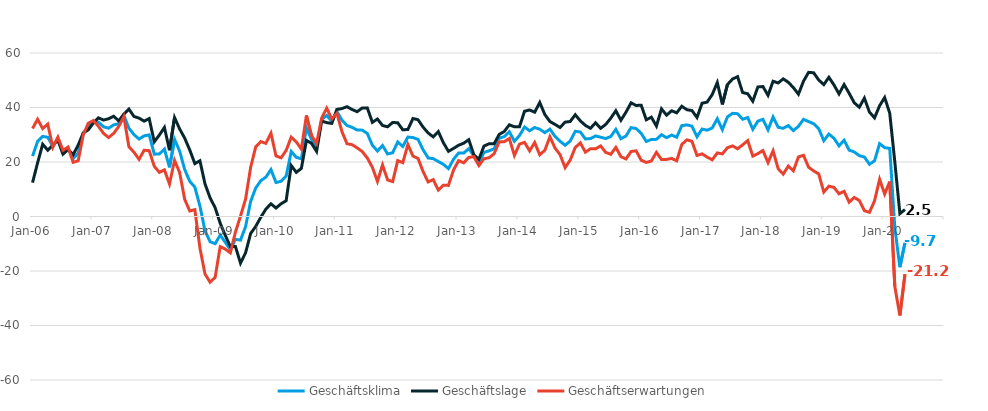
| Category | Geschäftsklima | Geschäftslage | Geschäftserwartungen |
|---|---|---|---|
| 2006-01-01 | 22.149 | 12.438 | 32.303 |
| 2006-02-01 | 27.555 | 19.705 | 35.685 |
| 2006-03-01 | 29.38 | 26.528 | 32.269 |
| 2006-04-01 | 29.074 | 24.346 | 33.901 |
| 2006-05-01 | 25.806 | 26.176 | 25.436 |
| 2006-06-01 | 28.536 | 27.957 | 29.115 |
| 2006-07-01 | 23.572 | 22.875 | 24.271 |
| 2006-08-01 | 25.039 | 24.574 | 25.504 |
| 2006-09-01 | 21.261 | 22.648 | 19.883 |
| 2006-10-01 | 23.302 | 26.195 | 20.447 |
| 2006-11-01 | 30.369 | 30.698 | 30.04 |
| 2006-12-01 | 33.025 | 31.805 | 34.252 |
| 2007-01-01 | 34.776 | 34.334 | 35.219 |
| 2007-02-01 | 34.623 | 36.186 | 33.07 |
| 2007-03-01 | 32.941 | 35.406 | 30.502 |
| 2007-04-01 | 32.398 | 35.869 | 28.977 |
| 2007-05-01 | 33.632 | 36.783 | 30.522 |
| 2007-06-01 | 34.063 | 35.077 | 33.054 |
| 2007-07-01 | 37.112 | 37.583 | 36.642 |
| 2007-08-01 | 32.407 | 39.418 | 25.601 |
| 2007-09-01 | 30.047 | 36.706 | 23.574 |
| 2007-10-01 | 28.417 | 36.106 | 20.979 |
| 2007-11-01 | 29.592 | 34.991 | 24.318 |
| 2007-12-01 | 29.961 | 35.919 | 24.153 |
| 2008-01-01 | 22.877 | 27.411 | 18.434 |
| 2008-02-01 | 22.932 | 29.884 | 16.191 |
| 2008-03-01 | 24.763 | 32.689 | 17.106 |
| 2008-04-01 | 18.039 | 24.317 | 11.937 |
| 2008-05-01 | 28.304 | 36.294 | 20.584 |
| 2008-06-01 | 23.998 | 32.137 | 16.145 |
| 2008-07-01 | 17.225 | 28.75 | 6.28 |
| 2008-08-01 | 12.913 | 24.404 | 2.011 |
| 2008-09-01 | 10.794 | 19.409 | 2.516 |
| 2008-10-01 | 3.835 | 20.467 | -11.543 |
| 2008-11-01 | -5.249 | 11.985 | -21.081 |
| 2008-12-01 | -9.24 | 6.871 | -24.096 |
| 2009-01-01 | -9.971 | 3.243 | -22.326 |
| 2009-02-01 | -6.813 | -2.483 | -11.047 |
| 2009-03-01 | -9.454 | -6.926 | -11.949 |
| 2009-04-01 | -12.199 | -11.042 | -13.348 |
| 2009-05-01 | -8.392 | -11.017 | -5.731 |
| 2009-06-01 | -8.674 | -17.097 | 0.137 |
| 2009-07-01 | -3.735 | -13.336 | 6.36 |
| 2009-08-01 | 5.533 | -6.245 | 18.027 |
| 2009-09-01 | 10.458 | -3.629 | 25.555 |
| 2009-10-01 | 13.151 | -0.286 | 27.491 |
| 2009-11-01 | 14.439 | 2.697 | 26.861 |
| 2009-12-01 | 17.239 | 4.658 | 30.593 |
| 2010-01-01 | 12.464 | 3.119 | 22.239 |
| 2010-02-01 | 12.932 | 4.667 | 21.531 |
| 2010-03-01 | 14.817 | 5.789 | 24.241 |
| 2010-04-01 | 23.86 | 18.711 | 29.129 |
| 2010-05-01 | 21.722 | 16.206 | 27.38 |
| 2010-06-01 | 21.158 | 17.643 | 24.731 |
| 2010-07-01 | 32.461 | 27.933 | 37.078 |
| 2010-08-01 | 28.273 | 26.854 | 29.7 |
| 2010-09-01 | 25.331 | 23.9 | 26.772 |
| 2010-10-01 | 35.584 | 35.017 | 36.153 |
| 2010-11-01 | 37.086 | 34.453 | 39.748 |
| 2010-12-01 | 34.965 | 34.171 | 35.761 |
| 2011-01-01 | 38.596 | 39.302 | 37.892 |
| 2011-02-01 | 35.348 | 39.613 | 31.16 |
| 2011-03-01 | 33.397 | 40.289 | 26.703 |
| 2011-04-01 | 32.726 | 39.267 | 26.363 |
| 2011-05-01 | 31.723 | 38.46 | 25.177 |
| 2011-06-01 | 31.694 | 39.823 | 23.84 |
| 2011-07-01 | 30.476 | 39.86 | 21.46 |
| 2011-08-01 | 26.148 | 34.55 | 18.047 |
| 2011-09-01 | 24.04 | 35.774 | 12.89 |
| 2011-10-01 | 26.04 | 33.401 | 18.91 |
| 2011-11-01 | 22.963 | 32.918 | 13.433 |
| 2011-12-01 | 23.391 | 34.512 | 12.798 |
| 2012-01-01 | 27.349 | 34.384 | 20.525 |
| 2012-02-01 | 25.696 | 31.807 | 19.747 |
| 2012-03-01 | 29.163 | 31.943 | 26.416 |
| 2012-04-01 | 28.973 | 35.96 | 22.193 |
| 2012-05-01 | 28.293 | 35.514 | 21.293 |
| 2012-06-01 | 24.485 | 32.8 | 16.467 |
| 2012-07-01 | 21.477 | 30.638 | 12.681 |
| 2012-08-01 | 21.231 | 29.218 | 13.522 |
| 2012-09-01 | 20.174 | 31.167 | 9.705 |
| 2012-10-01 | 19.141 | 27.056 | 11.501 |
| 2012-11-01 | 17.581 | 23.928 | 11.415 |
| 2012-12-01 | 20.991 | 24.972 | 17.08 |
| 2013-01-01 | 23.315 | 26.159 | 20.506 |
| 2013-02-01 | 23.272 | 26.891 | 19.71 |
| 2013-03-01 | 24.889 | 28.178 | 21.647 |
| 2013-04-01 | 22.31 | 22.638 | 21.983 |
| 2013-05-01 | 19.843 | 20.99 | 18.701 |
| 2013-06-01 | 23.509 | 25.838 | 21.205 |
| 2013-07-01 | 24.108 | 26.688 | 21.557 |
| 2013-08-01 | 24.845 | 26.684 | 23.022 |
| 2013-09-01 | 28.739 | 30.125 | 27.362 |
| 2013-10-01 | 29.314 | 31.199 | 27.445 |
| 2013-11-01 | 31.124 | 33.647 | 28.629 |
| 2013-12-01 | 27.598 | 32.918 | 22.399 |
| 2014-01-01 | 29.712 | 32.901 | 26.566 |
| 2014-02-01 | 32.851 | 38.627 | 27.215 |
| 2014-03-01 | 31.463 | 39.087 | 24.081 |
| 2014-04-01 | 32.653 | 38.282 | 27.157 |
| 2014-05-01 | 32.041 | 41.831 | 22.647 |
| 2014-06-01 | 30.768 | 37.431 | 24.293 |
| 2014-07-01 | 32.052 | 34.858 | 29.28 |
| 2014-08-01 | 29.429 | 33.797 | 25.144 |
| 2014-09-01 | 27.629 | 32.666 | 22.7 |
| 2014-10-01 | 26.136 | 34.629 | 17.95 |
| 2014-11-01 | 27.682 | 34.865 | 20.718 |
| 2014-12-01 | 31.267 | 37.348 | 25.341 |
| 2015-01-01 | 31.019 | 35.09 | 27.017 |
| 2015-02-01 | 28.458 | 33.425 | 23.597 |
| 2015-03-01 | 28.593 | 32.365 | 24.883 |
| 2015-04-01 | 29.559 | 34.404 | 24.815 |
| 2015-05-01 | 29.106 | 32.352 | 25.906 |
| 2015-06-01 | 28.6 | 33.78 | 23.535 |
| 2015-07-01 | 29.368 | 36.091 | 22.836 |
| 2015-08-01 | 31.998 | 38.815 | 25.376 |
| 2015-09-01 | 28.544 | 35.322 | 21.962 |
| 2015-10-01 | 29.537 | 38.289 | 21.107 |
| 2015-11-01 | 32.608 | 41.7 | 23.858 |
| 2015-12-01 | 32.269 | 40.745 | 24.092 |
| 2016-01-01 | 30.526 | 40.844 | 20.651 |
| 2016-02-01 | 27.535 | 35.501 | 19.838 |
| 2016-03-01 | 28.266 | 36.444 | 20.371 |
| 2016-04-01 | 28.309 | 33.183 | 23.537 |
| 2016-05-01 | 30.015 | 39.497 | 20.907 |
| 2016-06-01 | 28.922 | 37.196 | 20.936 |
| 2016-07-01 | 29.891 | 38.794 | 21.32 |
| 2016-08-01 | 29.074 | 38.047 | 20.439 |
| 2016-09-01 | 33.333 | 40.447 | 26.43 |
| 2016-10-01 | 33.605 | 39.198 | 28.142 |
| 2016-11-01 | 33.177 | 38.883 | 27.607 |
| 2016-12-01 | 29.266 | 36.334 | 22.409 |
| 2017-01-01 | 32.093 | 41.578 | 22.98 |
| 2017-02-01 | 31.672 | 41.973 | 21.81 |
| 2017-03-01 | 32.467 | 44.749 | 20.801 |
| 2017-04-01 | 35.889 | 49.156 | 23.33 |
| 2017-05-01 | 31.876 | 41.137 | 22.969 |
| 2017-06-01 | 36.544 | 48.423 | 25.234 |
| 2017-07-01 | 37.851 | 50.43 | 25.904 |
| 2017-08-01 | 37.726 | 51.326 | 24.861 |
| 2017-09-01 | 35.684 | 45.479 | 26.281 |
| 2017-10-01 | 36.301 | 45.047 | 27.868 |
| 2017-11-01 | 32.017 | 42.312 | 22.158 |
| 2017-12-01 | 34.98 | 47.53 | 23.067 |
| 2018-01-01 | 35.66 | 47.692 | 24.212 |
| 2018-02-01 | 31.793 | 44.467 | 19.777 |
| 2018-03-01 | 36.525 | 49.625 | 24.112 |
| 2018-04-01 | 32.735 | 49.008 | 17.526 |
| 2018-05-01 | 32.379 | 50.508 | 15.562 |
| 2018-06-01 | 33.369 | 49.249 | 18.501 |
| 2018-07-01 | 31.529 | 47.303 | 16.762 |
| 2018-08-01 | 33.086 | 44.889 | 21.852 |
| 2018-09-01 | 35.664 | 49.662 | 22.451 |
| 2018-10-01 | 34.844 | 52.896 | 18.08 |
| 2018-11-01 | 34.039 | 52.744 | 16.718 |
| 2018-12-01 | 32.217 | 50.085 | 15.625 |
| 2019-01-01 | 27.832 | 48.404 | 8.964 |
| 2019-02-01 | 30.243 | 51.078 | 11.136 |
| 2019-03-01 | 28.718 | 48.286 | 10.693 |
| 2019-04-01 | 25.916 | 44.986 | 8.33 |
| 2019-05-01 | 27.989 | 48.422 | 9.236 |
| 2019-06-01 | 24.351 | 45.222 | 5.256 |
| 2019-07-01 | 23.696 | 41.746 | 6.993 |
| 2019-08-01 | 22.318 | 40.106 | 5.848 |
| 2019-09-01 | 21.832 | 43.442 | 2.14 |
| 2019-10-01 | 19.165 | 38.333 | 1.539 |
| 2019-11-01 | 20.445 | 36.206 | 5.736 |
| 2019-12-01 | 26.743 | 40.65 | 13.639 |
| 2020-01-01 | 25.258 | 43.663 | 8.244 |
| 2020-02-01 | 25.006 | 37.905 | 12.805 |
| 2020-03-01 | -4.147 | 20.056 | -25.689 |
| 2020-04-01 | -18.596 | 1.052 | -36.324 |
| 2020-05-01 | -9.706 | 2.542 | -21.214 |